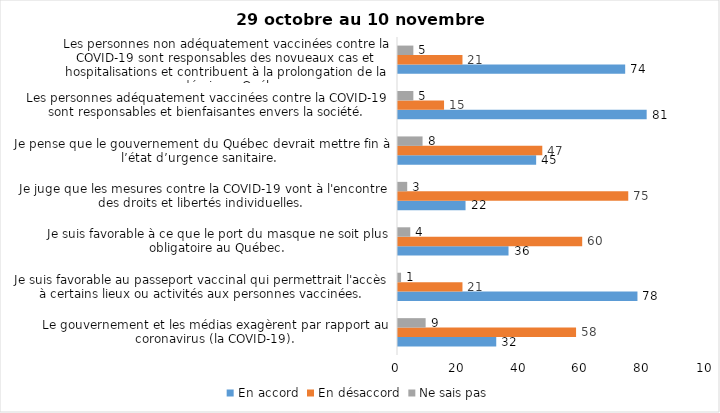
| Category | En accord | En désaccord | Ne sais pas |
|---|---|---|---|
| Le gouvernement et les médias exagèrent par rapport au coronavirus (la COVID-19). | 32 | 58 | 9 |
| Je suis favorable au passeport vaccinal qui permettrait l'accès à certains lieux ou activités aux personnes vaccinées. | 78 | 21 | 1 |
| Je suis favorable à ce que le port du masque ne soit plus obligatoire au Québec. | 36 | 60 | 4 |
| Je juge que les mesures contre la COVID-19 vont à l'encontre des droits et libertés individuelles.  | 22 | 75 | 3 |
| Je pense que le gouvernement du Québec devrait mettre fin à l’état d’urgence sanitaire.  | 45 | 47 | 8 |
| Les personnes adéquatement vaccinées contre la COVID-19 sont responsables et bienfaisantes envers la société. | 81 | 15 | 5 |
| Les personnes non adéquatement vaccinées contre la COVID-19 sont responsables des novueaux cas et hospitalisations et contribuent à la prolongation de la pandémie au Québec. | 74 | 21 | 5 |